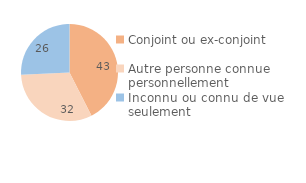
| Category | Series 0 |
|---|---|
| Conjoint ou ex-conjoint | 42.51 |
| Autre personne connue personnellement | 31.74 |
| Inconnu ou connu de vue seulement | 25.76 |